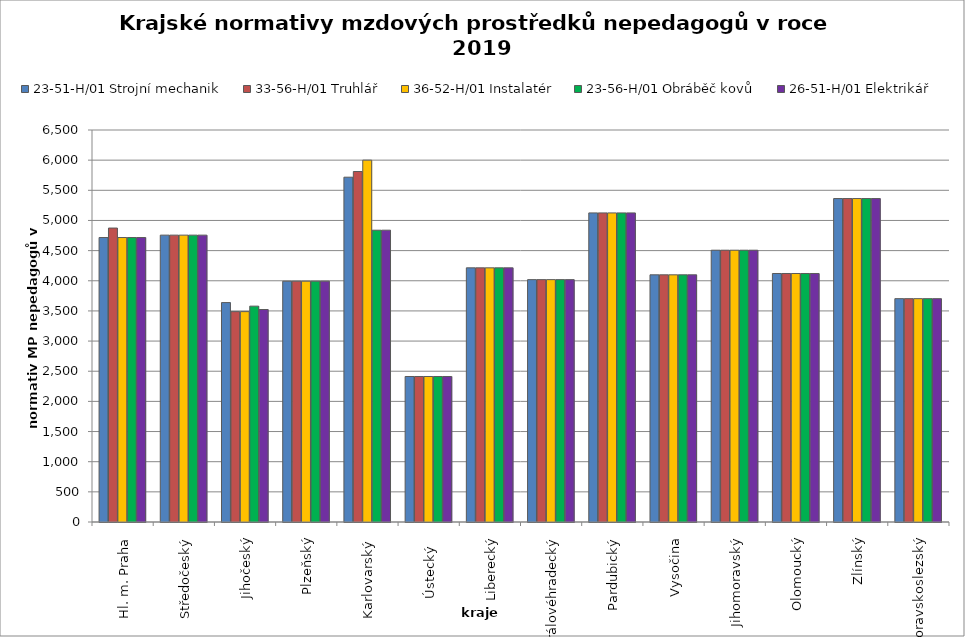
| Category | 23-51-H/01 Strojní mechanik | 33-56-H/01 Truhlář | 36-52-H/01 Instalatér | 23-56-H/01 Obráběč kovů | 26-51-H/01 Elektrikář |
|---|---|---|---|---|---|
| Hl. m. Praha | 4716.774 | 4874 | 4716.774 | 4716.774 | 4716.774 |
| Středočeský | 4756.8 | 4756.8 | 4756.8 | 4756.8 | 4756.8 |
| Jihočeský | 3638.193 | 3488.344 | 3488.344 | 3579.144 | 3523.574 |
| Plzeňský | 3992.727 | 3992.727 | 3992.727 | 3992.727 | 3992.727 |
| Karlovarský  | 5717.386 | 5811.556 | 6000 | 4838.323 | 4838.806 |
| Ústecký   | 2412.866 | 2412.866 | 2412.866 | 2412.866 | 2412.866 |
| Liberecký | 4214.357 | 4214.357 | 4214.357 | 4214.357 | 4214.357 |
| Královéhradecký | 4018.825 | 4018.825 | 4018.825 | 4018.825 | 4018.825 |
| Pardubický | 5125.091 | 5125.091 | 5125.091 | 5125.091 | 5125.091 |
| Vysočina | 4098.617 | 4098.617 | 4098.617 | 4098.617 | 4098.617 |
| Jihomoravský | 4506.792 | 4506.792 | 4506.792 | 4506.792 | 4506.792 |
| Olomoucký | 4120.751 | 4120.751 | 4120.751 | 4120.751 | 4120.751 |
| Zlínský | 5363.265 | 5363.265 | 5363.265 | 5363.265 | 5363.265 |
| Moravskoslezský | 3703.244 | 3703.244 | 3703.244 | 3703.244 | 3703.244 |